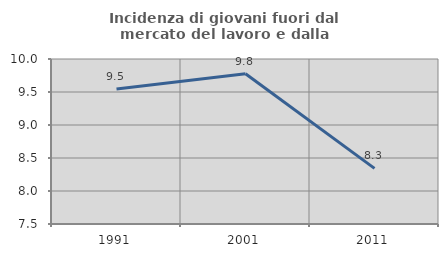
| Category | Incidenza di giovani fuori dal mercato del lavoro e dalla formazione  |
|---|---|
| 1991.0 | 9.545 |
| 2001.0 | 9.776 |
| 2011.0 | 8.343 |